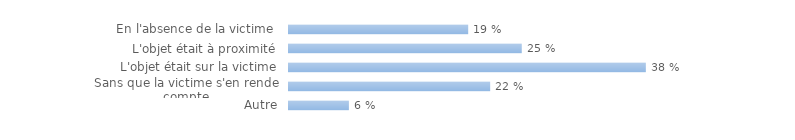
| Category | Series 0 |
|---|---|
| En l'absence de la victime  | 0.193 |
| L'objet était à proximité | 0.25 |
| L'objet était sur la victime | 0.384 |
| Sans que la victime s'en rende compte | 0.216 |
| Autre | 0.064 |